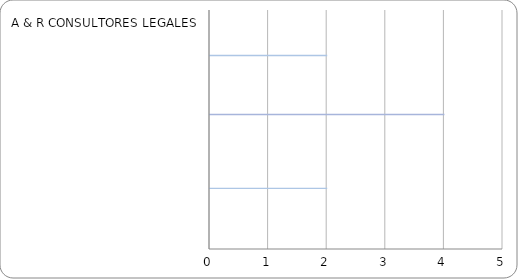
| Category | Series 0 | Series 1 | Series 2 | Series 3 | Series 4 | Series 5 | Series 6 | Series 7 | Series 8 | Series 9 | Series 10 | Series 11 | Series 12 | Series 13 | Series 14 | Series 15 | Series 16 |
|---|---|---|---|---|---|---|---|---|---|---|---|---|---|---|---|---|---|
| A & R CONSULTORES LEGALES | 0 | 0 | 0 | 0 | 0 | 0 | 0 | 0 | 0 | 0 | 0 | 0 | 0 | 0 | 0 | 0 | 0 |